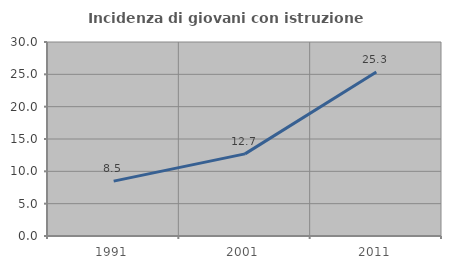
| Category | Incidenza di giovani con istruzione universitaria |
|---|---|
| 1991.0 | 8.481 |
| 2001.0 | 12.698 |
| 2011.0 | 25.35 |